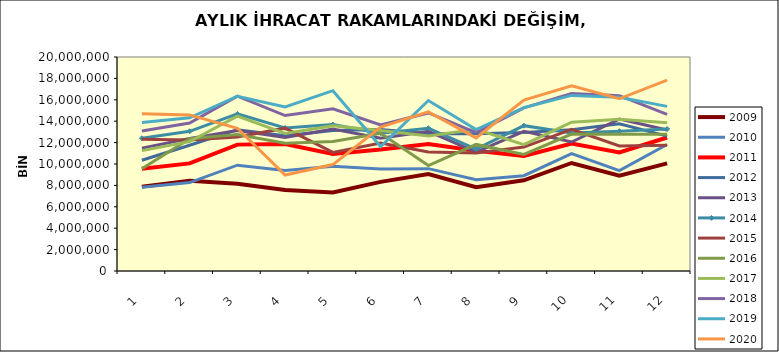
| Category | 2009 | 2010 | 2011 | 2012 | 2013 | 2014 | 2015 | 2016 | 2017 | 2018 | 2019 | 2020 |
|---|---|---|---|---|---|---|---|---|---|---|---|---|
| 0 | 7884493.524 | 7828748.058 | 9551084.639 | 10348187.166 | 11481521.079 | 12399761.948 | 12301766.75 | 9546115.4 | 11247585.677 | 13080096.762 | 13874826.012 | 14686571.697 |
| 1 | 8435115.834 | 8263237.814 | 10059126.307 | 11748000.124 | 12385690.909 | 13053292.493 | 12231860.14 | 12366388.057 | 12089908.934 | 13827132.655 | 14323043.042 | 14590645.391 |
| 2 | 8155485.081 | 9886488.171 | 11811085.16 | 13208572.977 | 13122058.141 | 14680110.78 | 12519910.438 | 12757672.093 | 14470814.059 | 16338253.918 | 16335862.397 | 13337963.507 |
| 3 | 7561696.283 | 9396006.654 | 11873269.447 | 12630226.718 | 12468202.903 | 13371185.664 | 13349346.866 | 11950497.685 | 12859938.791 | 14530822.873 | 15340619.825 | 8971149.086 |
| 4 | 7346407.528 | 9799958.117 | 10943364.372 | 13131530.961 | 13277209.017 | 13681906.159 | 11080385.127 | 12098611.067 | 13582079.731 | 15166648.044 | 16855105.097 | 9945551.187 |
| 5 | 8329692.783 | 9542907.644 | 11349953.558 | 13231198.688 | 12399973.962 | 12880924.246 | 11949647.086 | 12864154.06 | 13125306.944 | 13657091.159 | 11634653.881 | 13441948.869 |
| 6 | 9055733.671 | 9564682.545 | 11860004.271 | 12830675.307 | 13059519.685 | 13344776.958 | 11129358.974 | 9850124.872 | 12612074.056 | 14771360.698 | 15932004.724 | 14874577.423 |
| 7 | 7839908.842 | 8523451.973 | 11245124.657 | 12831394.572 | 11118300.903 | 11386828.925 | 11022045.344 | 11830762.82 | 13248462.99 | 12926754.199 | 13222876.223 | 12442671.819 |
| 8 | 8480708.387 | 8909230.521 | 10750626.099 | 12952651.722 | 13060371.039 | 13583120.906 | 11581703.842 | 10901638.452 | 11810080.805 | 15247368.846 | 15273579.961 | 15976635.293 |
| 9 | 10095768.03 | 10963586.27 | 11907219.297 | 13190769.655 | 12053704.638 | 12891630.102 | 13240039.088 | 12796159.91 | 13912699.494 | 16590652.49 | 16410781.68 | 17308722.315 |
| 10 | 8903010.773 | 9382369.718 | 11078524.743 | 13753052.493 | 14201227.351 | 13067348.107 | 11681989.013 | 12786936.247 | 14188323.116 | 16386878.393 | 16242650.391 | 16093928.349 |
| 11 | 10054591.867 | 11822551.699 | 12477486.28 | 12605476.173 | 13174857.46 | 13269271.402 | 11750818.76 | 12780523.145 | 13845665.817 | 14645696.251 | 15386718.469 | 17843802.097 |